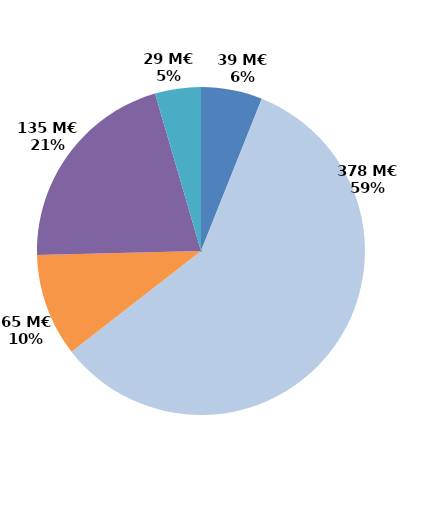
| Category | Series 0 |
|---|---|
| Contrats aidés marchand (hors IAE) | 39.117 |
| Contrats aidés non marchand (hors IAE) | 377.993 |
| Insertion par l'activité économique | 65.47 |
| Mesures en faveur des handicapés | 134.982 |
| Autres emplois aidés | 29.255 |